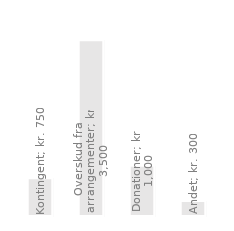
| Category | Årsindtægter |
|---|---|
| Kontingent | 750 |
| Overskud fra arrangementer | 3500 |
| Donationer | 1000 |
| Andet | 300 |